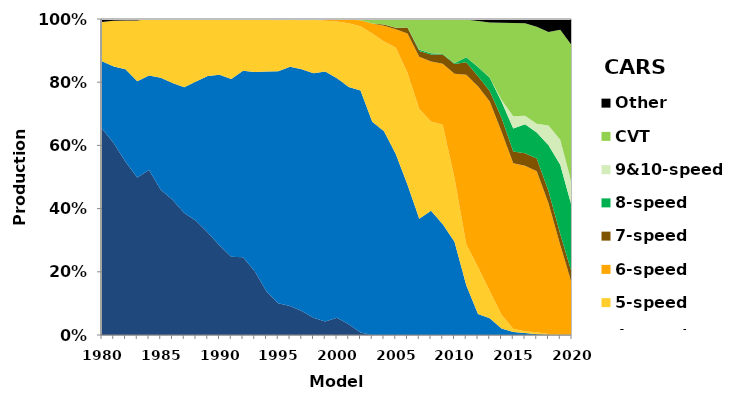
| Category | 3-speed | 4-speed | 5-speed | 6-speed | 7-speed | 8-speed | 9&10-speed | CVT | Other |
|---|---|---|---|---|---|---|---|---|---|
| 1980.0 | 0.653 | 0.213 | 0.124 | 0 | 0 | 0 | 0 | 0 | 0.01 |
| 1981.0 | 0.607 | 0.243 | 0.145 | 0 | 0 | 0 | 0 | 0 | 0.006 |
| 1982.0 | 0.548 | 0.293 | 0.154 | 0 | 0 | 0 | 0 | 0 | 0.005 |
| 1983.0 | 0.498 | 0.305 | 0.192 | 0 | 0 | 0 | 0 | 0 | 0.005 |
| 1984.0 | 0.522 | 0.299 | 0.179 | 0 | 0 | 0 | 0 | 0 | 0 |
| 1985.0 | 0.46 | 0.354 | 0.186 | 0 | 0 | 0 | 0 | 0 | 0 |
| 1986.0 | 0.428 | 0.369 | 0.203 | 0 | 0 | 0 | 0 | 0 | 0 |
| 1987.0 | 0.386 | 0.398 | 0.216 | 0 | 0 | 0 | 0 | 0 | 0 |
| 1988.0 | 0.361 | 0.441 | 0.198 | 0 | 0 | 0 | 0 | 0 | 0 |
| 1989.0 | 0.324 | 0.495 | 0.179 | 0 | 0 | 0 | 0 | 0.001 | 0 |
| 1990.0 | 0.283 | 0.54 | 0.175 | 0.001 | 0 | 0 | 0 | 0 | 0 |
| 1991.0 | 0.247 | 0.563 | 0.189 | 0.001 | 0 | 0 | 0 | 0 | 0 |
| 1992.0 | 0.246 | 0.591 | 0.163 | 0.001 | 0 | 0 | 0 | 0 | 0 |
| 1993.0 | 0.202 | 0.631 | 0.166 | 0.002 | 0 | 0 | 0 | 0 | 0 |
| 1994.0 | 0.138 | 0.696 | 0.163 | 0.003 | 0 | 0 | 0 | 0 | 0 |
| 1995.0 | 0.101 | 0.734 | 0.162 | 0.004 | 0 | 0 | 0 | 0 | 0 |
| 1996.0 | 0.092 | 0.758 | 0.147 | 0.003 | 0 | 0 | 0 | 0 | 0 |
| 1997.0 | 0.076 | 0.765 | 0.155 | 0.003 | 0 | 0 | 0 | 0.001 | 0 |
| 1998.0 | 0.055 | 0.774 | 0.168 | 0.003 | 0 | 0 | 0 | 0.001 | 0 |
| 1999.0 | 0.043 | 0.792 | 0.161 | 0.005 | 0 | 0 | 0 | 0 | 0 |
| 2000.0 | 0.055 | 0.758 | 0.179 | 0.008 | 0 | 0 | 0 | 0 | 0 |
| 2001.0 | 0.034 | 0.751 | 0.202 | 0.012 | 0 | 0 | 0 | 0.002 | 0 |
| 2002.0 | 0.008 | 0.766 | 0.203 | 0.019 | 0 | 0 | 0 | 0.004 | 0 |
| 2003.0 | 0 | 0.675 | 0.279 | 0.031 | 0 | 0 | 0 | 0.014 | 0 |
| 2004.0 | 0 | 0.645 | 0.284 | 0.05 | 0.004 | 0 | 0 | 0.017 | 0 |
| 2005.0 | 0 | 0.573 | 0.337 | 0.058 | 0.004 | 0 | 0 | 0.028 | 0 |
| 2006.0 | 0 | 0.475 | 0.354 | 0.125 | 0.019 | 0 | 0 | 0.027 | 0 |
| 2007.0 | 0 | 0.368 | 0.347 | 0.165 | 0.019 | 0.004 | 0 | 0.097 | 0 |
| 2008.0 | 0 | 0.393 | 0.282 | 0.19 | 0.022 | 0.004 | 0 | 0.108 | 0 |
| 2009.0 | 0 | 0.351 | 0.314 | 0.193 | 0.029 | 0.002 | 0 | 0.111 | 0 |
| 2010.0 | 0 | 0.295 | 0.202 | 0.33 | 0.031 | 0.003 | 0 | 0.14 | 0 |
| 2011.0 | 0 | 0.158 | 0.129 | 0.537 | 0.039 | 0.016 | 0 | 0.119 | 0.002 |
| 2012.0 | 0 | 0.067 | 0.148 | 0.572 | 0.032 | 0.029 | 0 | 0.146 | 0.006 |
| 2013.0 | 0 | 0.053 | 0.086 | 0.6 | 0.033 | 0.042 | 0 | 0.175 | 0.011 |
| 2014.0 | 0 | 0.021 | 0.044 | 0.58 | 0.043 | 0.052 | 0.006 | 0.244 | 0.011 |
| 2015.0 | 0 | 0.009 | 0.011 | 0.523 | 0.038 | 0.072 | 0.038 | 0.295 | 0.013 |
| 2016.0 | 0 | 0.006 | 0.006 | 0.524 | 0.039 | 0.092 | 0.027 | 0.293 | 0.014 |
| 2017.0 | 0 | 0.003 | 0.006 | 0.51 | 0.04 | 0.082 | 0.028 | 0.307 | 0.024 |
| 2018.0 | 0 | 0 | 0.003 | 0.413 | 0.039 | 0.145 | 0.062 | 0.296 | 0.041 |
| 2019.0 | 0 | 0 | 0.002 | 0.283 | 0.035 | 0.219 | 0.079 | 0.348 | 0.034 |
| 2020.0 | 0 | 0 | 0.002 | 0.159 | 0.033 | 0.209 | 0.073 | 0.439 | 0.084 |